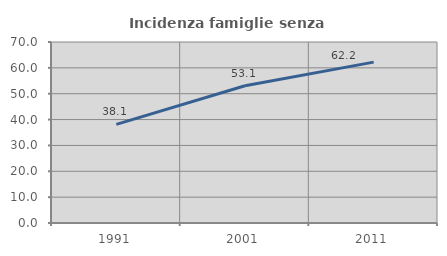
| Category | Incidenza famiglie senza nuclei |
|---|---|
| 1991.0 | 38.122 |
| 2001.0 | 53.097 |
| 2011.0 | 62.222 |